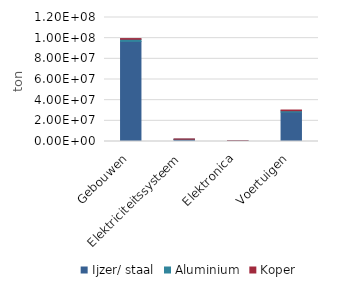
| Category | Ijzer/ staal | Aluminium | Koper |
|---|---|---|---|
| Gebouwen | 96879612.257 | 2072251.495 | 648901.312 |
| Elektriciteitssysteem | 1858189.527 | 328846.622 | 301654.451 |
| Elektronica | 572929 | 70542 | 49830 |
| Voertuigen | 28500000 | 1261200 | 705330 |